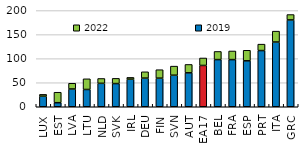
| Category | 2019 | 2022 |
|---|---|---|
| LUX | 22.015 | 3.735 |
| EST | 8.447 | 21.734 |
| LVA | 36.97 | 11.884 |
| LTU | 35.903 | 22.21 |
| NLD | 48.713 | 10.083 |
| SVK | 48.216 | 10.83 |
| IRL | 57.395 | 3.618 |
| DEU | 59.56 | 13.128 |
| FIN | 59.466 | 17.578 |
| SVN | 65.598 | 18.898 |
| AUT | 70.544 | 17.426 |
| EA17 | 85.897 | 15.519 |
| BEL | 98.075 | 16.906 |
| FRA | 98.043 | 17.931 |
| ESP | 95.505 | 21.93 |
| PRT | 116.84 | 13.357 |
| ITA | 134.582 | 22.641 |
| GRC | 180.506 | 11.223 |